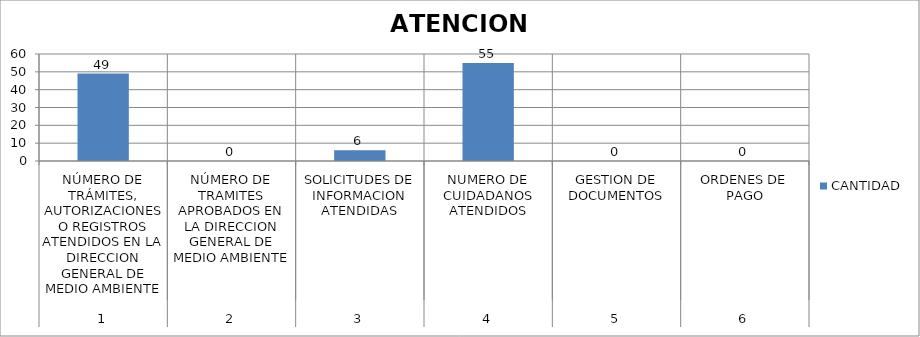
| Category | CANTIDAD |
|---|---|
| 0 | 49 |
| 1 | 0 |
| 2 | 6 |
| 3 | 55 |
| 4 | 0 |
| 5 | 0 |